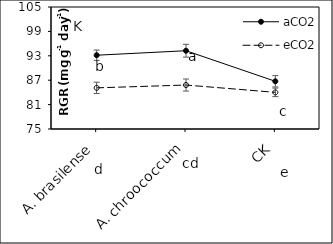
| Category | aCO2 | eCO2 |
|---|---|---|
|    A. brasilense | 93.145 | 85.12 |
|    A. chroococcum | 94.246 | 85.812 |
| CK | 86.729 | 84.011 |